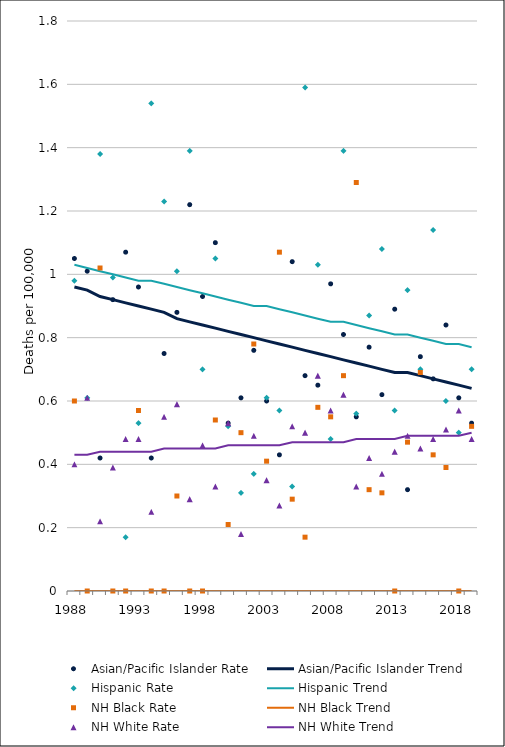
| Category | Asian/Pacific Islander Rate | Asian/Pacific Islander Trend | Hispanic Rate | Hispanic Trend | NH Black Rate | NH Black Trend | NH White Rate | NH White Trend |
|---|---|---|---|---|---|---|---|---|
| 1988.0 | 1.05 | 0.96 | 0.98 | 1.03 | 0.6 | 0 | 0.4 | 0.43 |
| 1989.0 | 1.01 | 0.95 | 0.61 | 1.02 | 0 | 0 | 0.61 | 0.43 |
| 1990.0 | 0.42 | 0.93 | 1.38 | 1.01 | 1.02 | 0 | 0.22 | 0.44 |
| 1991.0 | 0.92 | 0.92 | 0.99 | 1 | 0 | 0 | 0.39 | 0.44 |
| 1992.0 | 1.07 | 0.91 | 0.17 | 0.99 | 0 | 0 | 0.48 | 0.44 |
| 1993.0 | 0.96 | 0.9 | 0.53 | 0.98 | 0.57 | 0 | 0.48 | 0.44 |
| 1994.0 | 0.42 | 0.89 | 1.54 | 0.98 | 0 | 0 | 0.25 | 0.44 |
| 1995.0 | 0.75 | 0.88 | 1.23 | 0.97 | 0 | 0 | 0.55 | 0.45 |
| 1996.0 | 0.88 | 0.86 | 1.01 | 0.96 | 0.3 | 0 | 0.59 | 0.45 |
| 1997.0 | 1.22 | 0.85 | 1.39 | 0.95 | 0 | 0 | 0.29 | 0.45 |
| 1998.0 | 0.93 | 0.84 | 0.7 | 0.94 | 0 | 0 | 0.46 | 0.45 |
| 1999.0 | 1.1 | 0.83 | 1.05 | 0.93 | 0.54 | 0 | 0.33 | 0.45 |
| 2000.0 | 0.53 | 0.82 | 0.52 | 0.92 | 0.21 | 0 | 0.53 | 0.46 |
| 2001.0 | 0.61 | 0.81 | 0.31 | 0.91 | 0.5 | 0 | 0.18 | 0.46 |
| 2002.0 | 0.76 | 0.8 | 0.37 | 0.9 | 0.78 | 0 | 0.49 | 0.46 |
| 2003.0 | 0.6 | 0.79 | 0.61 | 0.9 | 0.41 | 0 | 0.35 | 0.46 |
| 2004.0 | 0.43 | 0.78 | 0.57 | 0.89 | 1.07 | 0 | 0.27 | 0.46 |
| 2005.0 | 1.04 | 0.77 | 0.33 | 0.88 | 0.29 | 0 | 0.52 | 0.47 |
| 2006.0 | 0.68 | 0.76 | 1.59 | 0.87 | 0.17 | 0 | 0.5 | 0.47 |
| 2007.0 | 0.65 | 0.75 | 1.03 | 0.86 | 0.58 | 0 | 0.68 | 0.47 |
| 2008.0 | 0.97 | 0.74 | 0.48 | 0.85 | 0.55 | 0 | 0.57 | 0.47 |
| 2009.0 | 0.81 | 0.73 | 1.39 | 0.85 | 0.68 | 0 | 0.62 | 0.47 |
| 2010.0 | 0.55 | 0.72 | 0.56 | 0.84 | 1.29 | 0 | 0.33 | 0.48 |
| 2011.0 | 0.77 | 0.71 | 0.87 | 0.83 | 0.32 | 0 | 0.42 | 0.48 |
| 2012.0 | 0.62 | 0.7 | 1.08 | 0.82 | 0.31 | 0 | 0.37 | 0.48 |
| 2013.0 | 0.89 | 0.69 | 0.57 | 0.81 | 0 | 0 | 0.44 | 0.48 |
| 2014.0 | 0.32 | 0.69 | 0.95 | 0.81 | 0.47 | 0 | 0.49 | 0.49 |
| 2015.0 | 0.74 | 0.68 | 0.7 | 0.8 | 0.69 | 0 | 0.45 | 0.49 |
| 2016.0 | 0.67 | 0.67 | 1.14 | 0.79 | 0.43 | 0 | 0.48 | 0.49 |
| 2017.0 | 0.84 | 0.66 | 0.6 | 0.78 | 0.39 | 0 | 0.51 | 0.49 |
| 2018.0 | 0.61 | 0.65 | 0.5 | 0.78 | 0 | 0 | 0.57 | 0.49 |
| 2019.0 | 0.53 | 0.64 | 0.7 | 0.77 | 0.52 | 0 | 0.48 | 0.5 |